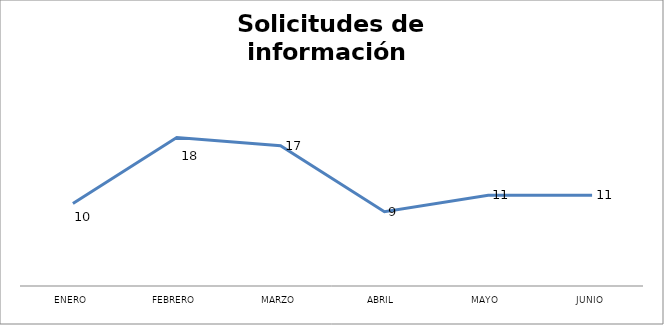
| Category | Series 0 |
|---|---|
| ENERO | 10 |
| FEBRERO | 18 |
| MARZO | 17 |
| ABRIL | 9 |
| MAYO | 11 |
| JUNIO | 11 |